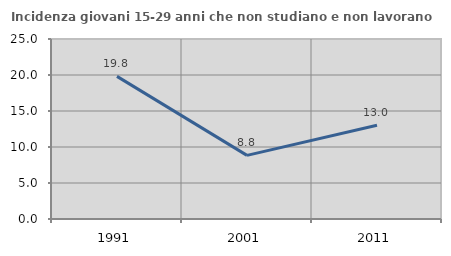
| Category | Incidenza giovani 15-29 anni che non studiano e non lavorano  |
|---|---|
| 1991.0 | 19.811 |
| 2001.0 | 8.837 |
| 2011.0 | 13.021 |